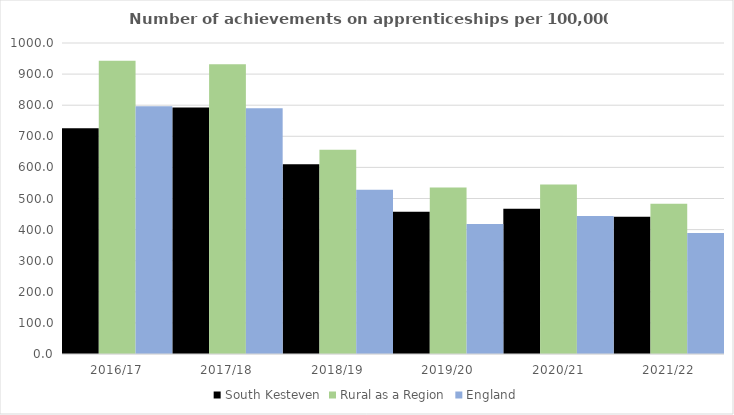
| Category | South Kesteven | Rural as a Region | England |
|---|---|---|---|
| 2016/17 | 726 | 942.594 | 797 |
| 2017/18 | 793 | 931.709 | 790 |
| 2018/19 | 610 | 656.44 | 528 |
| 2019/20 | 457 | 535.552 | 418 |
| 2020/21 | 467 | 545.333 | 444 |
| 2021/22 | 441 | 482.936 | 389 |